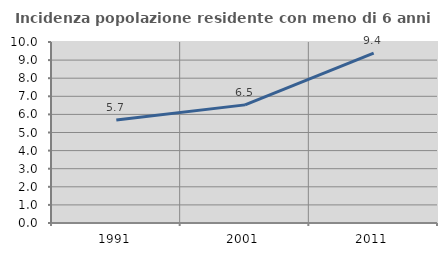
| Category | Incidenza popolazione residente con meno di 6 anni |
|---|---|
| 1991.0 | 5.693 |
| 2001.0 | 6.526 |
| 2011.0 | 9.384 |